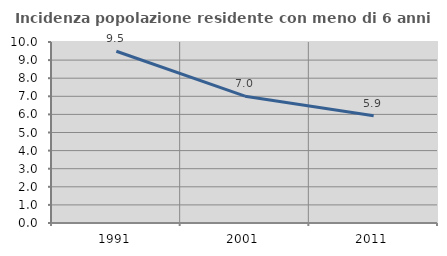
| Category | Incidenza popolazione residente con meno di 6 anni |
|---|---|
| 1991.0 | 9.487 |
| 2001.0 | 7.007 |
| 2011.0 | 5.926 |